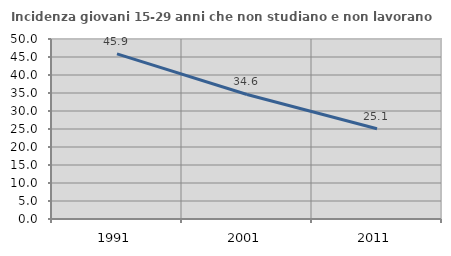
| Category | Incidenza giovani 15-29 anni che non studiano e non lavorano  |
|---|---|
| 1991.0 | 45.854 |
| 2001.0 | 34.599 |
| 2011.0 | 25.051 |